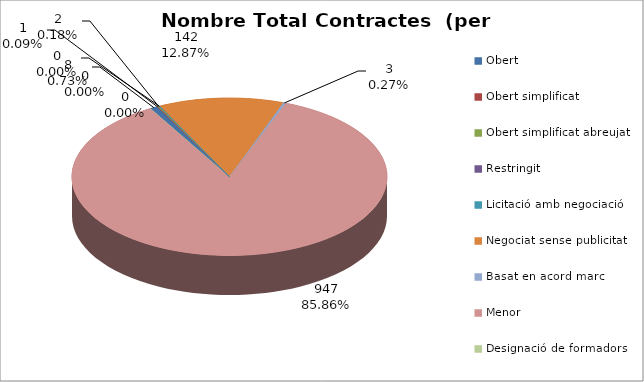
| Category | Nombre Total Contractes |
|---|---|
| Obert | 8 |
| Obert simplificat | 1 |
| Obert simplificat abreujat | 2 |
| Restringit | 0 |
| Licitació amb negociació | 0 |
| Negociat sense publicitat | 142 |
| Basat en acord marc | 3 |
| Menor | 947 |
| Designació de formadors | 0 |